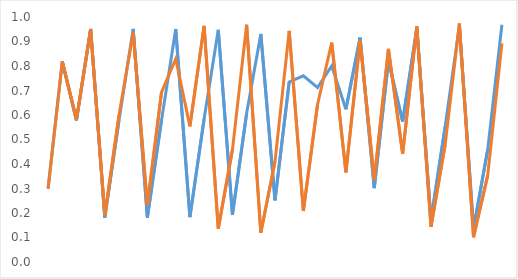
| Category | Series 0 | Series 1 |
|---|---|---|
| 0 | 0.3 | 0.299 |
| 1 | 0.819 | 0.817 |
| 2 | 0.578 | 0.582 |
| 3 | 0.951 | 0.949 |
| 4 | 0.181 | 0.19 |
| 5 | 0.578 | 0.599 |
| 6 | 0.951 | 0.937 |
| 7 | 0.181 | 0.231 |
| 8 | 0.579 | 0.694 |
| 9 | 0.951 | 0.829 |
| 10 | 0.183 | 0.554 |
| 11 | 0.583 | 0.964 |
| 12 | 0.948 | 0.136 |
| 13 | 0.193 | 0.459 |
| 14 | 0.607 | 0.968 |
| 15 | 0.931 | 0.119 |
| 16 | 0.252 | 0.41 |
| 17 | 0.735 | 0.943 |
| 18 | 0.76 | 0.208 |
| 19 | 0.712 | 0.643 |
| 20 | 0.8 | 0.895 |
| 21 | 0.623 | 0.366 |
| 22 | 0.916 | 0.905 |
| 23 | 0.301 | 0.336 |
| 24 | 0.821 | 0.87 |
| 25 | 0.573 | 0.442 |
| 26 | 0.954 | 0.962 |
| 27 | 0.171 | 0.144 |
| 28 | 0.554 | 0.48 |
| 29 | 0.964 | 0.973 |
| 30 | 0.136 | 0.101 |
| 31 | 0.459 | 0.354 |
| 32 | 0.968 | 0.892 |